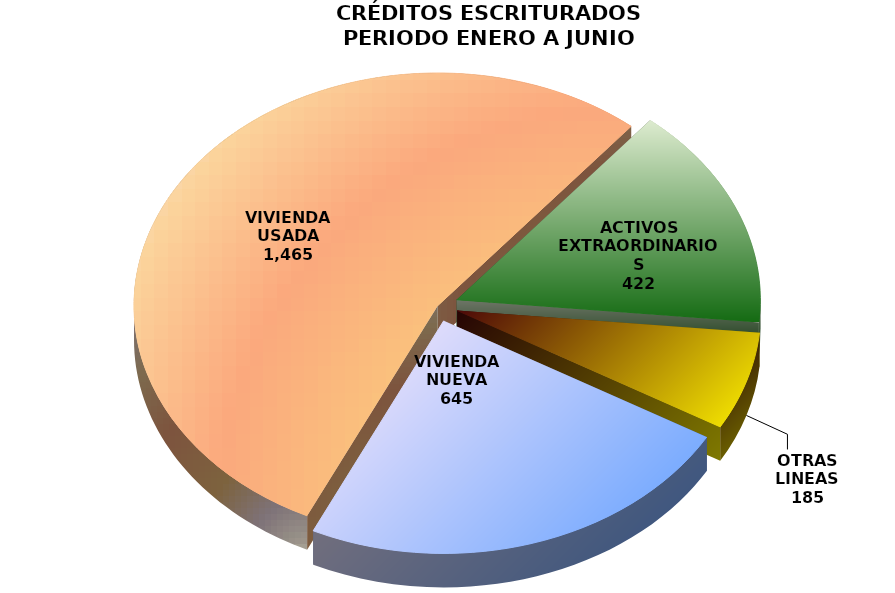
| Category | Series 0 |
|---|---|
| VIVIENDA NUEVA | 645 |
| VIVIENDA USADA | 1465 |
| ACTIVOS EXTRAORDINARIOS | 422 |
| OTRAS LINEAS | 185 |